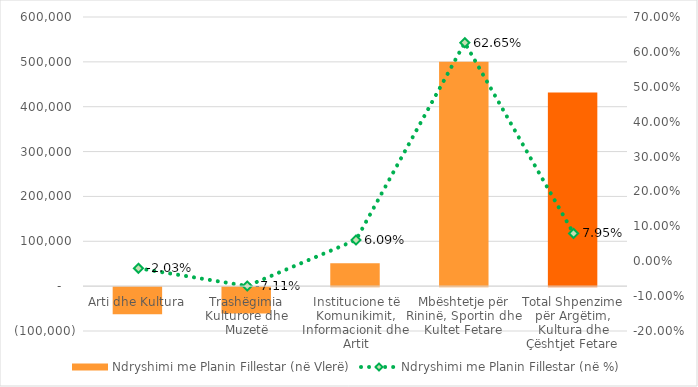
| Category | Ndryshimi me Planin Fillestar (në Vlerë) |
|---|---|
| Arti dhe Kultura | -60300 |
| Trashëgimia Kulturore dhe Muzetë | -58760 |
| Institucione të Komunikimit, Informacionit dhe Artit | 51000 |
| Mbështetje për Rininë, Sportin dhe Kultet Fetare | 500000 |
| Total Shpenzime për Argëtim, Kultura dhe Çështjet Fetare | 431940 |